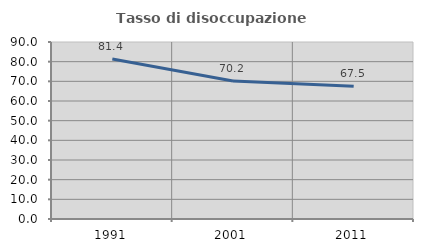
| Category | Tasso di disoccupazione giovanile  |
|---|---|
| 1991.0 | 81.36 |
| 2001.0 | 70.182 |
| 2011.0 | 67.474 |